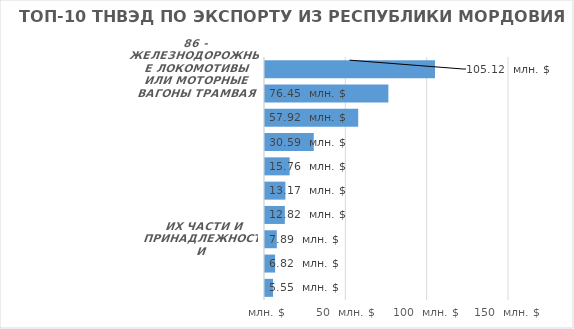
| Category | Итог |
|---|---|
| 86 - ЖЕЛЕЗНОДОРОЖНЫЕ ЛОКОМОТИВЫ ИЛИ МОТОРНЫЕ ВАГОНЫ ТРАМВАЯ, ПОДВИЖНОЙ СОСТАВ И ИХ ЧАСТИ; ПУТЕВОЕ ОБОРУДОВАНИЕ И УСТРОЙСТВА ДЛЯ ЖЕЛЕЗНЫХ ДОРОГ ИЛИ ТРАМВАЙНЫХ ПУТЕЙ И ИХ ЧАСТИ; МЕХАНИЧЕСКОЕ (ВКЛЮЧАЯ ЭЛЕКТРОМЕХАНИЧЕСКОЕ) СИГНАЛЬНОЕ ОБОРУДОВАНИЕ ВСЕХ ВИДОВ | 105115.05 |
| 44 - ДРЕВЕСИНА И ИЗДЕЛИЯ ИЗ НЕЕ; ДРЕВЕСНЫЙ УГОЛЬ | 76450.45 |
| 76 - АЛЮМИНИЙ И ИЗДЕЛИЯ ИЗ НЕГО | 57917.81 |
| 85 - ЭЛЕКТРИЧЕСКИЕ МАШИНЫ И ОБОРУДОВАНИЕ, ИХ ЧАСТИ; ЗВУКОЗАПИСЫВАЮЩАЯ И ЗВУКОВОСПРОИЗВОДЯЩАЯ АППАРАТУРА, АППАРАТУРА ДЛЯ ЗАПИСИ И ВОСПРОИЗВЕДЕНИЯ ТЕЛЕВИЗИОННОГО ИЗОБРАЖЕНИЯ И ЗВУКА, ИХ ЧАСТИ И ПРИНАДЛЕЖНОСТИ | 30593.37 |
| 72 - ЧЕРНЫЕ МЕТАЛЛЫ | 15759.8 |
| 38 - ПРОЧИЕ ХИМИЧЕСКИЕ ПРОДУКТЫ | 13165.46 |
| 02 - МЯСО И ПИЩЕВЫЕ МЯСНЫЕ СУБПРОДУКТЫ | 12816.04 |
| 10 - ЗЛАКИ | 7885.82 |
| 16 - ГОТОВЫЕ ПРОДУКТЫ ИЗ МЯСА, РЫБЫ ИЛИ РАКООБРАЗНЫХ, МОЛЛЮСКОВ ИЛИ ПРОЧИХ ВОДНЫХ БЕСПОЗВОНОЧНЫХ | 6820.43 |
| 74 - МЕДЬ И ИЗДЕЛИЯ ИЗ НЕЕ | 5552.91 |